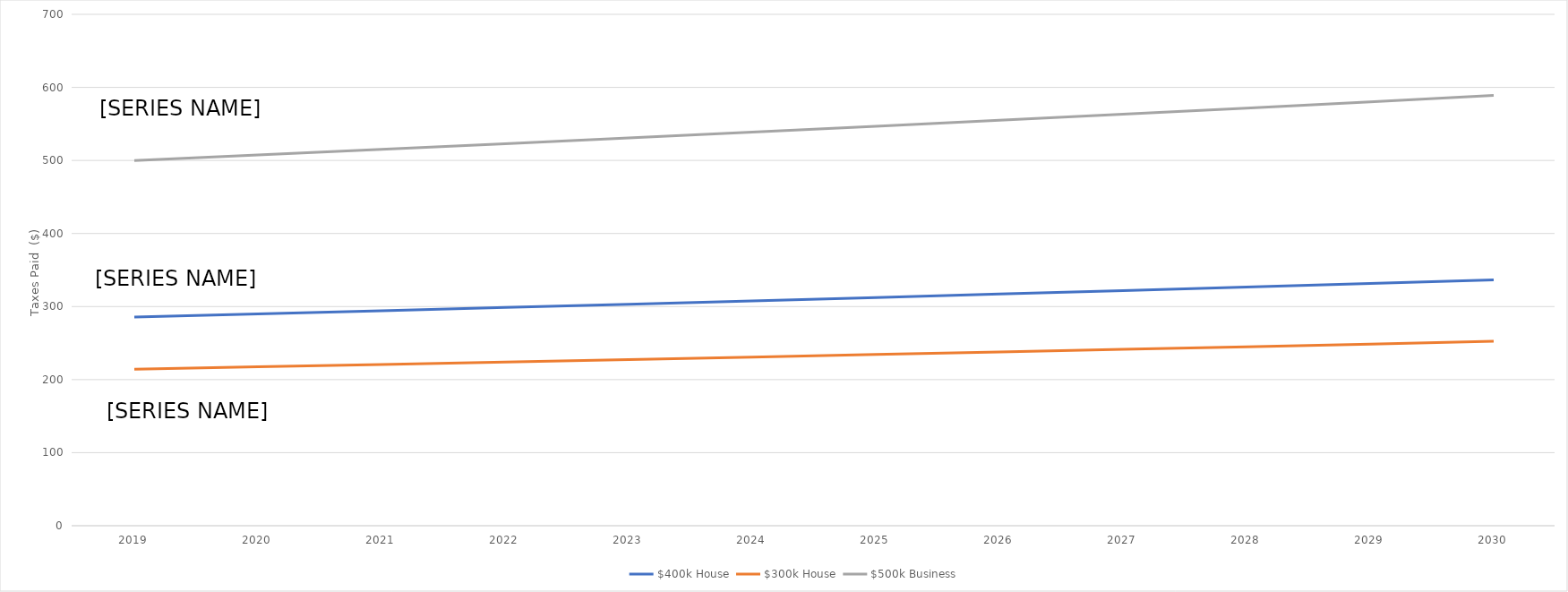
| Category | $400k House | $300k House | $500k Business |
|---|---|---|---|
| 2019.0 | 285.714 | 214.286 | 500 |
| 2020.0 | 290 | 217.5 | 507.5 |
| 2021.0 | 294.35 | 220.762 | 515.112 |
| 2022.0 | 298.765 | 224.074 | 522.839 |
| 2023.0 | 303.247 | 227.435 | 530.682 |
| 2024.0 | 307.795 | 230.847 | 538.642 |
| 2025.0 | 312.412 | 234.309 | 546.722 |
| 2026.0 | 317.099 | 237.824 | 554.922 |
| 2027.0 | 321.855 | 241.391 | 563.246 |
| 2028.0 | 326.683 | 245.012 | 571.695 |
| 2029.0 | 331.583 | 248.687 | 580.27 |
| 2030.0 | 336.557 | 252.418 | 588.974 |